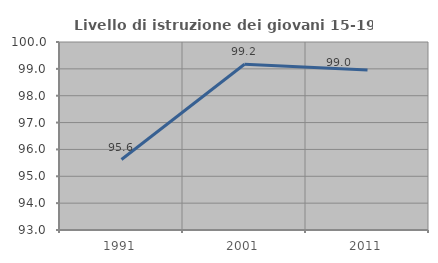
| Category | Livello di istruzione dei giovani 15-19 anni |
|---|---|
| 1991.0 | 95.623 |
| 2001.0 | 99.174 |
| 2011.0 | 98.958 |